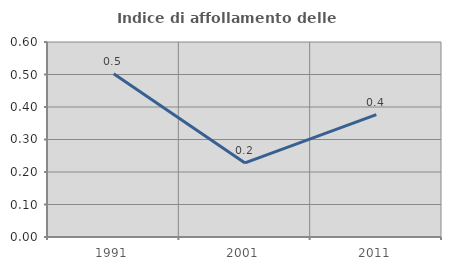
| Category | Indice di affollamento delle abitazioni  |
|---|---|
| 1991.0 | 0.502 |
| 2001.0 | 0.228 |
| 2011.0 | 0.376 |